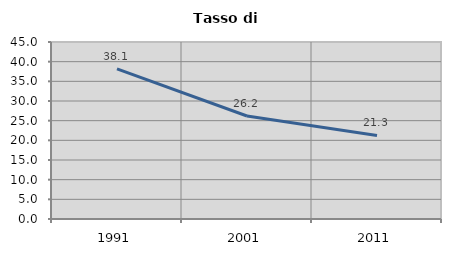
| Category | Tasso di disoccupazione   |
|---|---|
| 1991.0 | 38.145 |
| 2001.0 | 26.189 |
| 2011.0 | 21.251 |